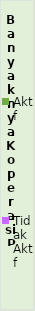
| Category | Aktif | Tidak Aktif |
|---|---|---|
| 2018.0 | 1212 | 72 |
| 2019.0 | 1292 | 11 |
| 2020.0 | 1316 | 11 |
| 2021.0 | 1320 | 12 |